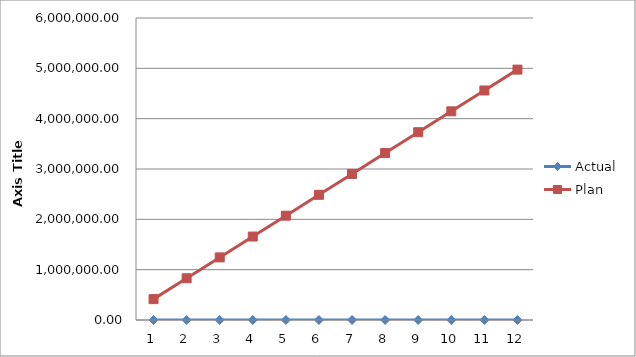
| Category | Actual | Plan |
|---|---|---|
| 0 | 0 | 414550.917 |
| 1 | 0 | 829101.833 |
| 2 | 0 | 1243652.75 |
| 3 | 0 | 1658203.667 |
| 4 | 0 | 2072754.583 |
| 5 | 0 | 2487305.5 |
| 6 | 0 | 2901856.417 |
| 7 | 0 | 3316407.333 |
| 8 | 0 | 3730958.25 |
| 9 | 0 | 4145509.167 |
| 10 | 0 | 4560060.083 |
| 11 | 0 | 4974611 |